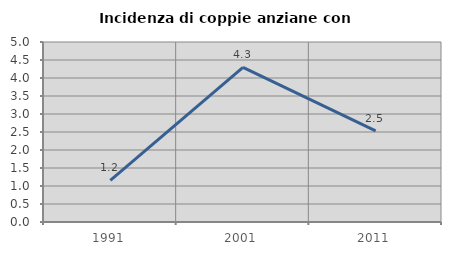
| Category | Incidenza di coppie anziane con figli |
|---|---|
| 1991.0 | 1.156 |
| 2001.0 | 4.294 |
| 2011.0 | 2.534 |